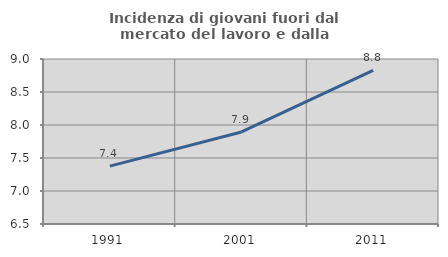
| Category | Incidenza di giovani fuori dal mercato del lavoro e dalla formazione  |
|---|---|
| 1991.0 | 7.377 |
| 2001.0 | 7.895 |
| 2011.0 | 8.829 |